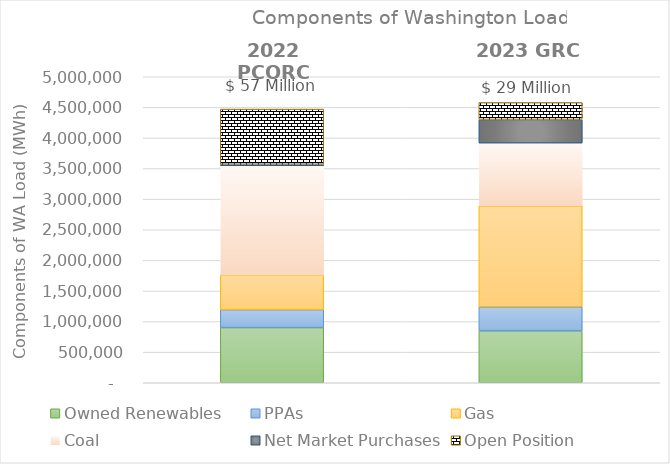
| Category | Owned Renewables | PPAs | Gas | Coal | Net Market Purchases | Open Position |
|---|---|---|---|---|---|---|
| 2022 PCORC | 901279.191 | 293811.972 | 560491.284 | 1790550.599 | 25285.65 | 900108.318 |
| 2023 GRC | 846680.777 | 393932.798 | 1650493.052 | 1025046.861 | 386359.598 | 274925.914 |